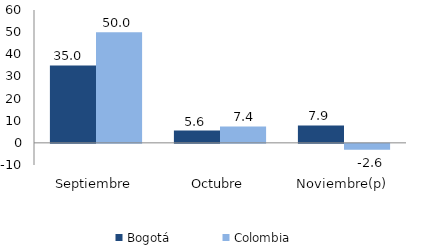
| Category | Bogotá | Colombia |
|---|---|---|
| Septiembre | 34.974 | 50.006 |
| Octubre | 5.564 | 7.418 |
| Noviembre(p) | 7.871 | -2.635 |